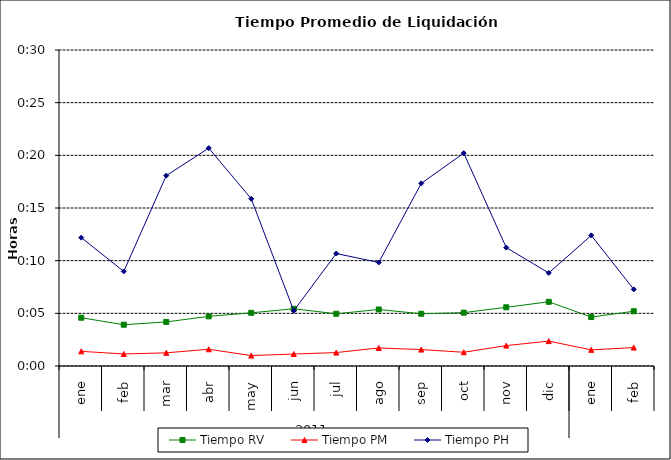
| Category | Tiempo RV | Tiempo PM | Tiempo PH |
|---|---|---|---|
| 0 | 0.003 | 0.001 | 0.009 |
| 1 | 0.003 | 0.001 | 0.006 |
| 2 | 0.003 | 0.001 | 0.013 |
| 3 | 0.003 | 0.001 | 0.014 |
| 4 | 0.004 | 0.001 | 0.011 |
| 5 | 0.004 | 0.001 | 0.004 |
| 6 | 0.003 | 0.001 | 0.007 |
| 7 | 0.004 | 0.001 | 0.007 |
| 8 | 0.003 | 0.001 | 0.012 |
| 9 | 0.004 | 0.001 | 0.014 |
| 10 | 0.004 | 0.001 | 0.008 |
| 11 | 0.004 | 0.002 | 0.006 |
| 12 | 0.003 | 0.001 | 0.009 |
| 13 | 0.004 | 0.001 | 0.005 |